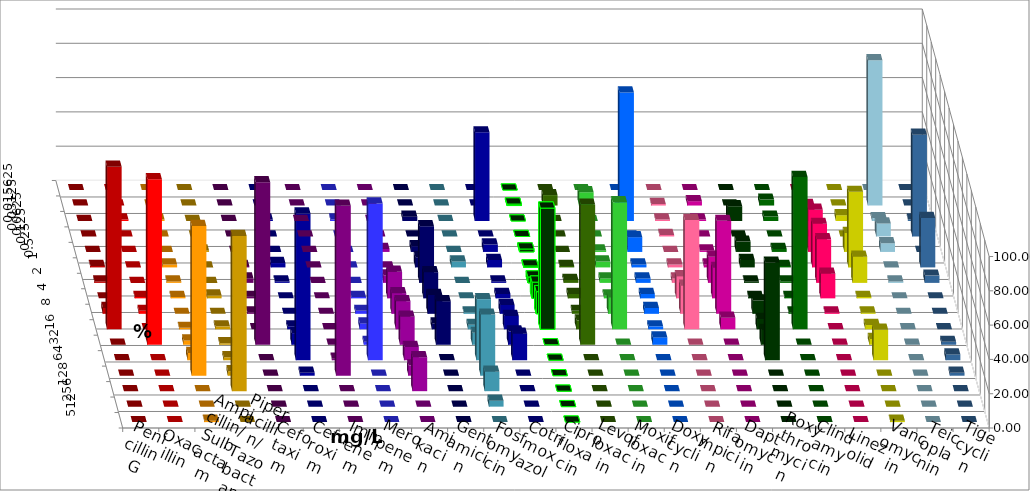
| Category | Penicillin G | Oxacillin | Ampicillin/ Sulbactam | Piperacillin/ Tazobactam | Cefotaxim | Cefuroxim | Imipenem | Meropenem | Amikacin | Gentamicin | Fosfomycin | Cotrimoxazol | Ciprofloxacin | Levofloxacin | Moxifloxacin | Doxycyclin | Rifampicin | Daptomycin | Roxythromycin | Clindamycin | Linezolid | Vancomycin | Teicoplanin | Tigecyclin |
|---|---|---|---|---|---|---|---|---|---|---|---|---|---|---|---|---|---|---|---|---|---|---|---|---|
| 0.015625 | 0 | 0 | 0 | 0 | 0 | 0 | 0 | 0 | 0 | 0 | 0 | 0 | 0 | 0 | 0 | 0 | 0 | 0 | 0 | 0 | 0 | 0 | 0 | 0 |
| 0.03125 | 0 | 0 | 0 | 0 | 0 | 0 | 0 | 0 | 0 | 0 | 0 | 0 | 0.862 | 6.087 | 7.759 | 0 | 0.862 | 2.542 | 0 | 3.448 | 0 | 0 | 0 | 84.746 |
| 0.0625 | 0 | 0.862 | 0.847 | 0 | 0 | 0 | 0.847 | 0.862 | 0 | 2.542 | 0 | 51.724 | 0 | 0 | 0 | 75 | 0.862 | 0.847 | 8.621 | 2.586 | 9.322 | 3.39 | 0.847 | 1.695 |
| 0.125 | 0 | 0 | 0 | 0 | 0 | 0 | 0 | 0 | 0 | 0 | 0 | 0 | 0 | 0 | 0 | 0 | 0.862 | 0 | 0 | 0 | 0 | 0 | 59.322 | 7.627 |
| 0.25 | 0 | 0 | 0 | 0.862 | 0 | 0 | 0 | 0 | 1.724 | 3.39 | 0 | 4.31 | 1.724 | 0 | 0.862 | 8.621 | 0 | 0.847 | 6.034 | 1.724 | 24.576 | 11.017 | 0 | 5.085 |
| 0.5 | 0.862 | 0 | 1.695 | 0 | 0.87 | 0 | 2.542 | 0 | 0 | 5.932 | 3.478 | 4.31 | 0.862 | 0.87 | 3.448 | 1.724 | 1.724 | 1.695 | 4.31 | 0.862 | 25.424 | 44.068 | 28.814 | 0 |
| 1.0 | 0.862 | 0 | 0.847 | 0 | 2.609 | 0 | 0.847 | 0 | 4.31 | 33.051 | 0 | 0.862 | 3.448 | 1.739 | 2.586 | 2.586 | 2.586 | 15.254 | 0.862 | 0.862 | 25.424 | 15.254 | 4.237 | 0.847 |
| 2.0 | 0 | 0.862 | 0.847 | 1.724 | 0.87 | 0 | 0 | 0.862 | 15.517 | 15.254 | 0 | 2.586 | 9.483 | 2.609 | 1.724 | 2.586 | 12.931 | 17.797 | 0.862 | 0.862 | 14.407 | 0.847 | 0 | 0 |
| 4.0 | 3.448 | 1.724 | 0 | 0 | 0.87 | 0 | 0 | 1.724 | 12.069 | 11.017 | 0.87 | 5.172 | 12.931 | 1.739 | 9.483 | 3.448 | 16.379 | 54.237 | 7.759 | 0.862 | 0.847 | 0.847 | 0 | 0 |
| 8.0 | 94.828 | 0 | 0.847 | 1.724 | 0 | 0 | 1.695 | 3.448 | 16.379 | 3.39 | 2.609 | 7.759 | 70.69 | 5.217 | 74.138 | 1.724 | 63.793 | 6.78 | 6.034 | 88.793 | 0 | 2.542 | 0 | 0 |
| 16.0 | 0 | 96.552 | 2.542 | 0.862 | 94.783 | 0 | 6.78 | 1.724 | 16.379 | 25.424 | 6.957 | 7.759 | 0 | 81.739 | 0 | 4.31 | 0 | 0 | 8.621 | 0 | 0 | 3.39 | 1.695 | 0 |
| 32.0 | 0 | 0 | 4.237 | 1.724 | 0 | 0.862 | 85.593 | 91.379 | 7.759 | 0 | 35.652 | 15.517 | 0 | 0 | 0 | 0 | 0 | 0 | 56.897 | 0 | 0 | 17.797 | 3.39 | 0 |
| 64.0 | 0 | 0 | 87.288 | 2.586 | 0 | 99.138 | 1.695 | 0 | 6.034 | 0 | 35.652 | 0 | 0 | 0 | 0 | 0 | 0 | 0 | 0 | 0 | 0 | 0 | 1.695 | 0 |
| 128.0 | 0 | 0 | 0 | 90.517 | 0 | 0 | 0 | 0 | 19.828 | 0 | 11.304 | 0 | 0 | 0 | 0 | 0 | 0 | 0 | 0 | 0 | 0 | 0 | 0 | 0 |
| 256.0 | 0 | 0 | 0 | 0 | 0 | 0 | 0 | 0 | 0 | 0 | 3.478 | 0 | 0 | 0 | 0 | 0 | 0 | 0 | 0 | 0 | 0 | 0 | 0 | 0 |
| 512.0 | 0 | 0 | 0.847 | 0 | 0 | 0 | 0 | 0 | 0 | 0 | 0 | 0 | 0 | 0 | 0 | 0 | 0 | 0 | 0 | 0 | 0 | 0.847 | 0 | 0 |